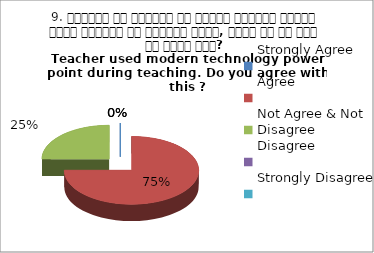
| Category | 9. शिक्षक ने शिक्षण के दौरान आधुनिक तकनीक पावर पॉइन्ट का प्रयोग किया, क्या आप इस बात से सहमत हैं? 
Teacher used modern technology power point during teaching. Do you agree with this ?
 Agree Agree Not Agree & Not Disagree Agree |
|---|---|
| Strongly Agree | 0 |
| Agree | 3 |
| Not Agree & Not Disagree | 1 |
| Disagree | 0 |
| Strongly Disagree | 0 |